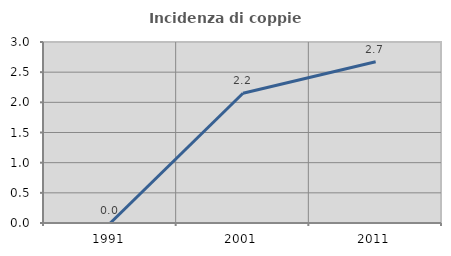
| Category | Incidenza di coppie miste |
|---|---|
| 1991.0 | 0 |
| 2001.0 | 2.151 |
| 2011.0 | 2.674 |